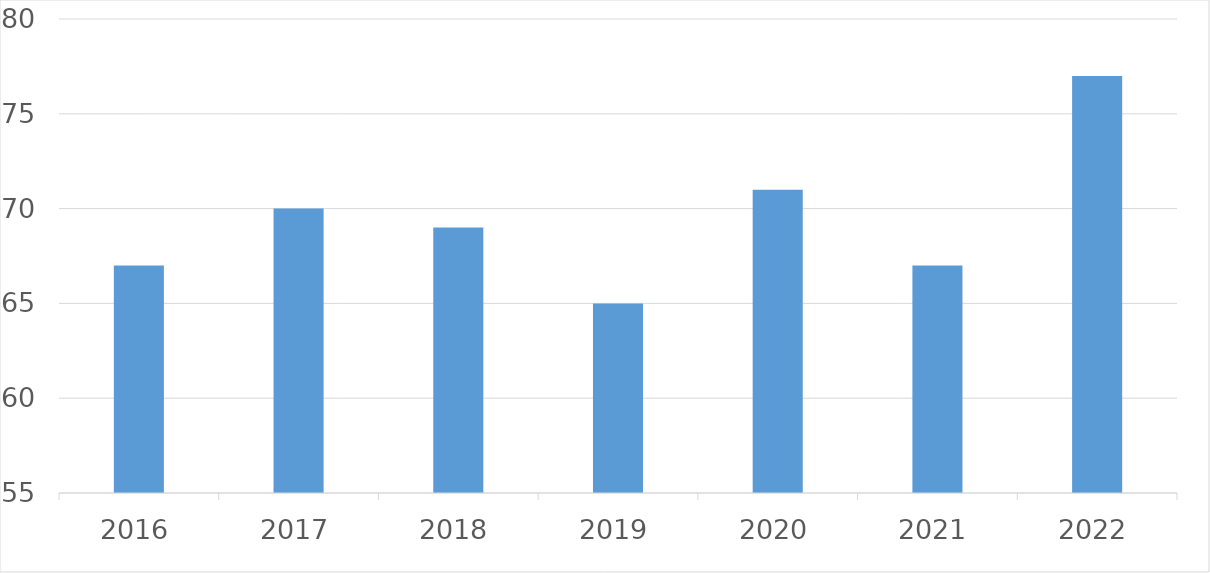
| Category | Series 0 |
|---|---|
| 2016 | 67 |
| 2017 | 70 |
| 2018 | 69 |
| 2019 | 65 |
| 2020 | 71 |
| 2021 | 67 |
| 2022 | 77 |